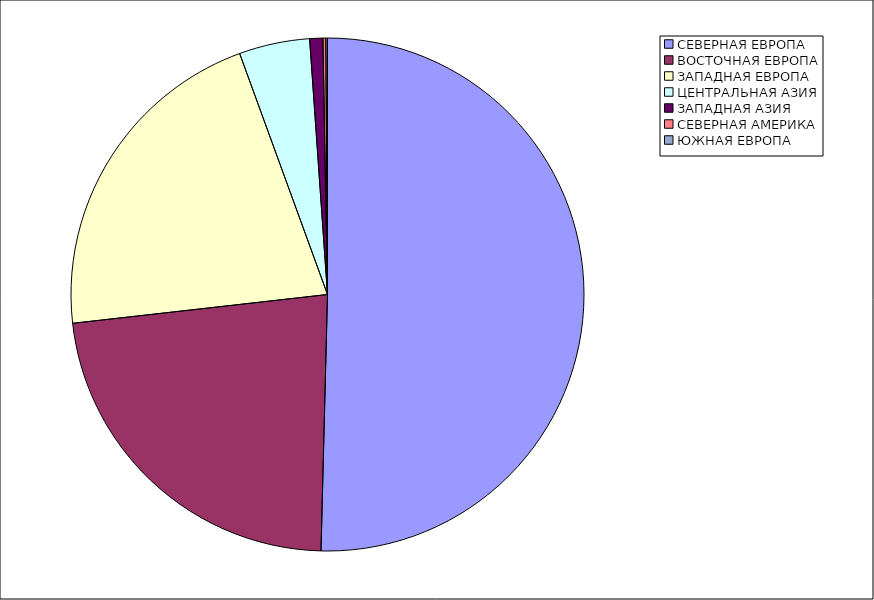
| Category | Оборот |
|---|---|
| СЕВЕРНАЯ ЕВРОПА | 50.404 |
| ВОСТОЧНАЯ ЕВРОПА | 22.803 |
| ЗАПАДНАЯ ЕВРОПА | 21.229 |
| ЦЕНТРАЛЬНАЯ АЗИЯ | 4.452 |
| ЗАПАДНАЯ АЗИЯ | 0.826 |
| СЕВЕРНАЯ АМЕРИКА | 0.181 |
| ЮЖНАЯ ЕВРОПА | 0.104 |